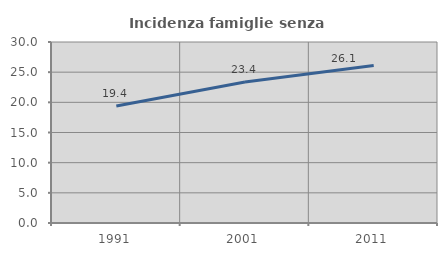
| Category | Incidenza famiglie senza nuclei |
|---|---|
| 1991.0 | 19.406 |
| 2001.0 | 23.364 |
| 2011.0 | 26.106 |